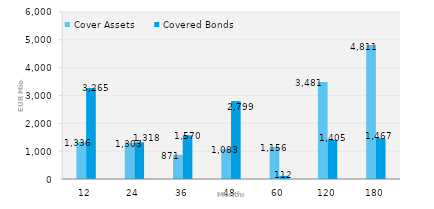
| Category | Cover Assets | Covered Bonds |
|---|---|---|
| 12.0 | 1336.25 | 3265.227 |
| 24.0 | 1303.167 | 1318.072 |
| 36.0 | 870.891 | 1570.173 |
| 48.0 | 1082.922 | 2798.984 |
| 60.0 | 1155.721 | 112.338 |
| 120.0 | 3481.267 | 1405.129 |
| 180.0 | 4811.433 | 1466.876 |